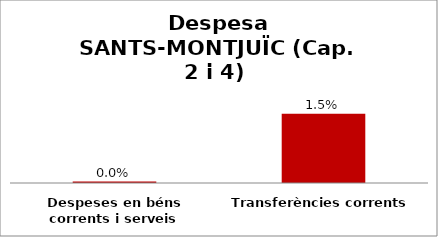
| Category | Series 0 |
|---|---|
| Despeses en béns corrents i serveis | 0 |
| Transferències corrents | 0.015 |